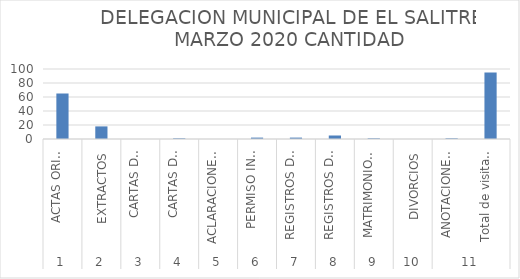
| Category | DELEGACION MUNICIPAL DE EL SALITRE FEBRERO 2020 |
|---|---|
| 0 | 65 |
| 1 | 18 |
| 2 | 0 |
| 3 | 1 |
| 4 | 0 |
| 5 | 2 |
| 6 | 2 |
| 7 | 5 |
| 8 | 1 |
| 9 | 0 |
| 10 | 1 |
| 11 | 95 |